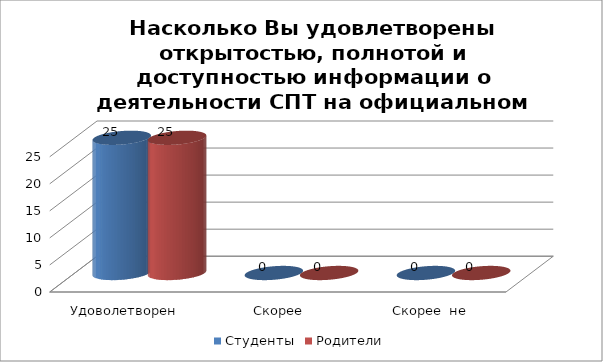
| Category | Студенты | Родители |
|---|---|---|
| Удоволетворен | 25 | 25 |
| Скорее удовлетворен | 0 | 0 |
| Скорее  не удовлетворен | 0 | 0 |